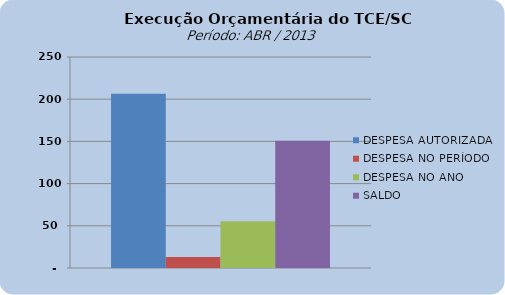
| Category | DESPESA AUTORIZADA | DESPESA NO PERÍODO | DESPESA NO ANO | SALDO |
|---|---|---|---|---|
| 0 | 206366571.19 | 12887407.84 | 55466395.73 | 150900175.46 |